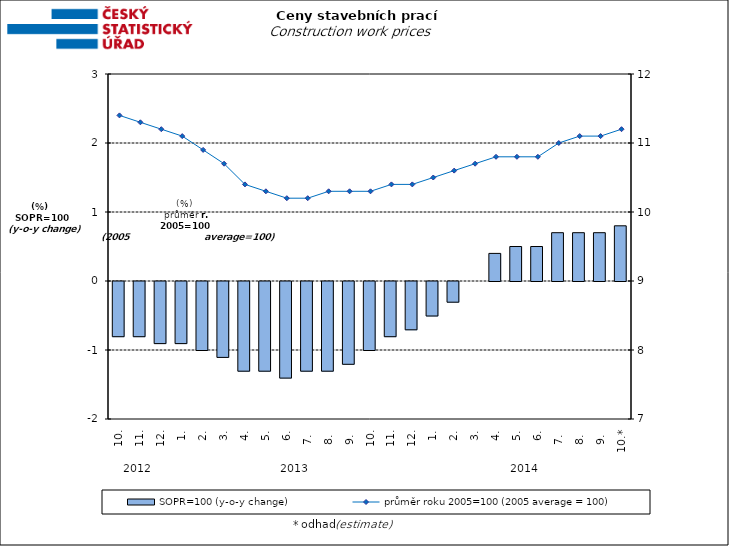
| Category | SOPR=100 (y-o-y change)   |
|---|---|
| 0 | -0.8 |
| 1 | -0.8 |
| 2 | -0.9 |
| 3 | -0.9 |
| 4 | -1 |
| 5 | -1.1 |
| 6 | -1.3 |
| 7 | -1.3 |
| 8 | -1.4 |
| 9 | -1.3 |
| 10 | -1.3 |
| 11 | -1.2 |
| 12 | -1 |
| 13 | -0.8 |
| 14 | -0.7 |
| 15 | -0.5 |
| 16 | -0.3 |
| 17 | 0 |
| 18 | 0.4 |
| 19 | 0.5 |
| 20 | 0.5 |
| 21 | 0.7 |
| 22 | 0.7 |
| 23 | 0.7 |
| 24 | 0.8 |